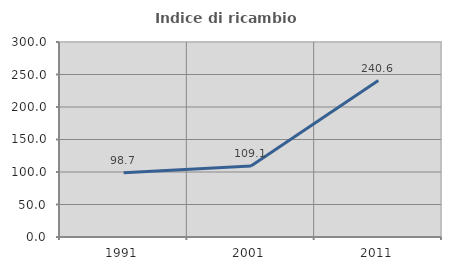
| Category | Indice di ricambio occupazionale  |
|---|---|
| 1991.0 | 98.712 |
| 2001.0 | 109.091 |
| 2011.0 | 240.602 |